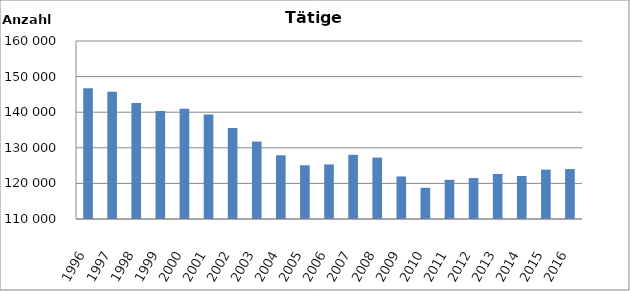
| Category | Series 0 |
|---|---|
| 1996.0 | 146742 |
| 1997.0 | 145717 |
| 1998.0 | 142598 |
| 1999.0 | 140319 |
| 2000.0 | 140983 |
| 2001.0 | 139341 |
| 2002.0 | 135596 |
| 2003.0 | 131743 |
| 2004.0 | 127904 |
| 2005.0 | 125099 |
| 2006.0 | 125327 |
| 2007.0 | 128030 |
| 2008.0 | 127238 |
| 2009.0 | 121954 |
| 2010.0 | 118762 |
| 2011.0 | 121003 |
| 2012.0 | 121500 |
| 2013.0 | 122658 |
| 2014.0 | 122086 |
| 2015.0 | 123861 |
| 2016.0 | 124018 |